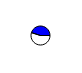
| Category | Series 0 |
|---|---|
| 0 | 3298496 |
| 1 | 2712037 |